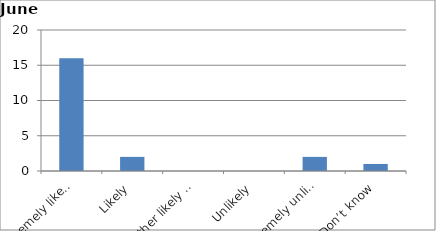
| Category | Series 0 |
|---|---|
| Extremely likely | 16 |
| Likely | 2 |
| Neither likely nor unlikely | 0 |
| Unlikely | 0 |
| Extremely unlikely | 2 |
| Don’t know | 1 |